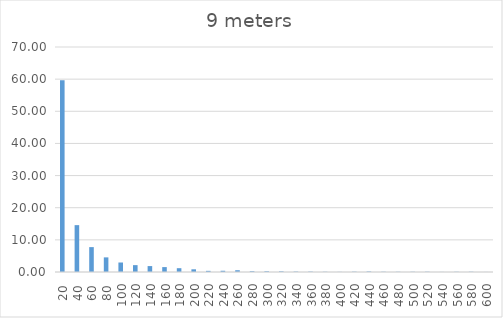
| Category | Series 0 |
|---|---|
| 20.0 | 59.62 |
| 40.0 | 14.58 |
| 60.0 | 7.741 |
| 80.0 | 4.549 |
| 100.0 | 2.955 |
| 120.0 | 2.136 |
| 140.0 | 1.841 |
| 160.0 | 1.525 |
| 180.0 | 1.184 |
| 200.0 | 0.84 |
| 220.0 | 0.358 |
| 240.0 | 0.385 |
| 260.0 | 0.55 |
| 280.0 | 0.237 |
| 300.0 | 0.225 |
| 320.0 | 0.193 |
| 340.0 | 0.128 |
| 360.0 | 0.115 |
| 380.0 | 0.071 |
| 400.0 | 0.038 |
| 420.0 | 0.097 |
| 440.0 | 0.155 |
| 460.0 | 0.077 |
| 480.0 | 0.064 |
| 500.0 | 0.071 |
| 520.0 | 0.084 |
| 540.0 | 0.026 |
| 560.0 | 0.064 |
| 580.0 | 0.077 |
| 600.0 | 0.013 |